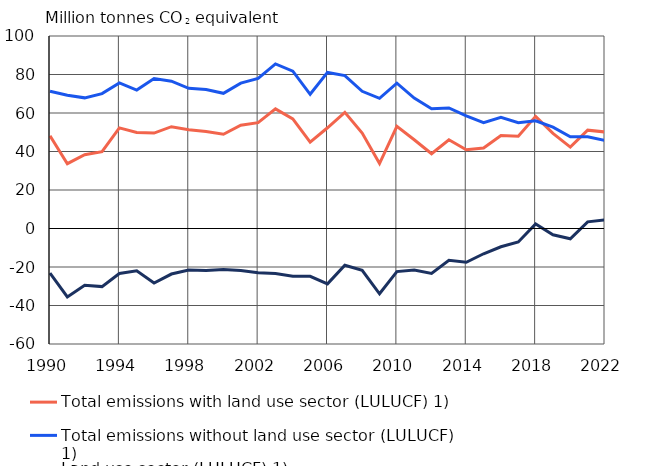
| Category | Total emissions with land use sector (LULUCF) 1) | Total emissions without land use sector (LULUCF) 1) | Land use sector (LULUCF) 1) |
|---|---|---|---|
| 1990.0 | 48.156 | 71.331 | -23.175 |
| 1991.0 | 33.667 | 69.247 | -35.58 |
| 1992.0 | 38.322 | 67.869 | -29.547 |
| 1993.0 | 39.893 | 70.077 | -30.184 |
| 1994.0 | 52.275 | 75.646 | -23.37 |
| 1995.0 | 49.889 | 71.89 | -22 |
| 1996.0 | 49.574 | 77.881 | -28.307 |
| 1997.0 | 52.88 | 76.539 | -23.659 |
| 1998.0 | 51.253 | 72.846 | -21.594 |
| 1999.0 | 50.395 | 72.162 | -21.766 |
| 2000.0 | 48.962 | 70.22 | -21.258 |
| 2001.0 | 53.661 | 75.537 | -21.876 |
| 2002.0 | 54.986 | 77.935 | -22.949 |
| 2003.0 | 62.155 | 85.521 | -23.366 |
| 2004.0 | 56.969 | 81.757 | -24.788 |
| 2005.0 | 44.863 | 69.713 | -24.85 |
| 2006.0 | 52.338 | 81.085 | -28.748 |
| 2007.0 | 60.312 | 79.413 | -19.101 |
| 2008.0 | 49.578 | 71.26 | -21.682 |
| 2009.0 | 33.723 | 67.63 | -33.906 |
| 2010.0 | 53.09 | 75.468 | -22.378 |
| 2011.0 | 46.1 | 67.72 | -21.62 |
| 2012.0 | 38.835 | 62.177 | -23.342 |
| 2013.0 | 46.089 | 62.646 | -16.557 |
| 2014.0 | 40.92 | 58.461 | -17.541 |
| 2015.0 | 41.83 | 54.961 | -13.131 |
| 2016.0 | 48.318 | 57.81 | -9.493 |
| 2017.0 | 47.972 | 55.003 | -7.032 |
| 2018.0 | 58.258 | 55.934 | 2.324 |
| 2019.0 | 49.413 | 52.646 | -3.233 |
| 2020.0 | 42.299 | 47.654 | -5.354 |
| 2021.0 | 51.078 | 47.604 | 3.474 |
| 2022.0 | 50.143 | 45.7 | 4.443 |